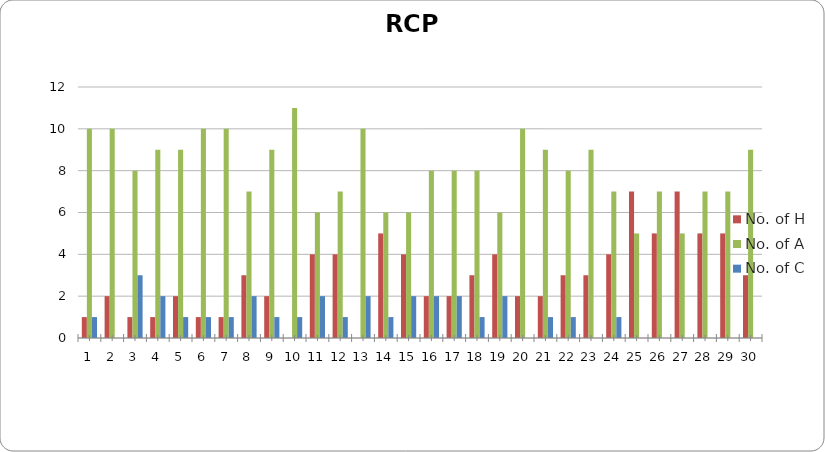
| Category | No. of H | No. of A | No. of C |
|---|---|---|---|
| 0 | 1 | 10 | 1 |
| 1 | 2 | 10 | 0 |
| 2 | 1 | 8 | 3 |
| 3 | 1 | 9 | 2 |
| 4 | 2 | 9 | 1 |
| 5 | 1 | 10 | 1 |
| 6 | 1 | 10 | 1 |
| 7 | 3 | 7 | 2 |
| 8 | 2 | 9 | 1 |
| 9 | 0 | 11 | 1 |
| 10 | 4 | 6 | 2 |
| 11 | 4 | 7 | 1 |
| 12 | 0 | 10 | 2 |
| 13 | 5 | 6 | 1 |
| 14 | 4 | 6 | 2 |
| 15 | 2 | 8 | 2 |
| 16 | 2 | 8 | 2 |
| 17 | 3 | 8 | 1 |
| 18 | 4 | 6 | 2 |
| 19 | 2 | 10 | 0 |
| 20 | 2 | 9 | 1 |
| 21 | 3 | 8 | 1 |
| 22 | 3 | 9 | 0 |
| 23 | 4 | 7 | 1 |
| 24 | 7 | 5 | 0 |
| 25 | 5 | 7 | 0 |
| 26 | 7 | 5 | 0 |
| 27 | 5 | 7 | 0 |
| 28 | 5 | 7 | 0 |
| 29 | 3 | 9 | 0 |